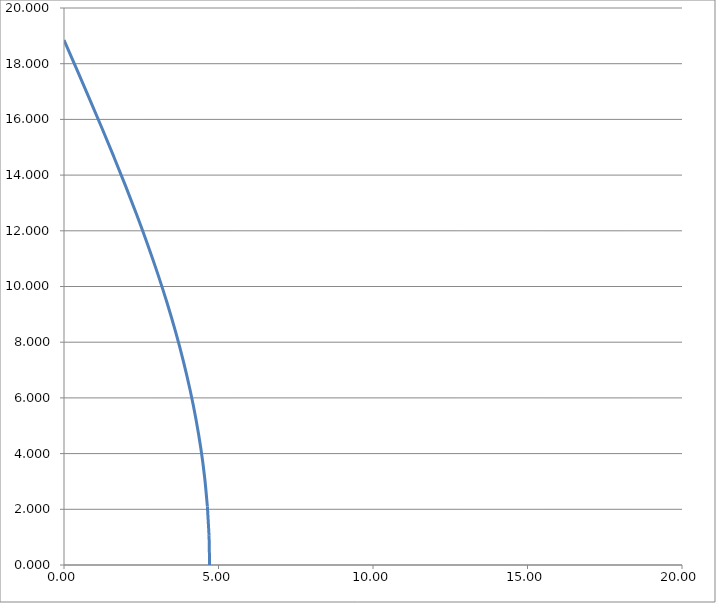
| Category | Series 0 |
|---|---|
| 4.71238898038469 | 0 |
| 4.694456917605194 | 1.047 |
| 4.640797203092136 | 2.094 |
| 4.5518182196735815 | 3.142 |
| 4.428197151140324 | 4.189 |
| 4.270874828468343 | 5.236 |
| 4.08104856952699 | 6.283 |
| 3.8601630667670364 | 7.33 |
| 3.6098993922387983 | 8.378 |
| 3.3321622036187746 | 9.425 |
| 3.029065248614663 | 10.472 |
| 2.7029152780689905 | 11.519 |
| 2.3561944901923453 | 12.566 |
| 1.9915416395362044 | 13.614 |
| 1.611731954477474 | 14.661 |
| 1.2196560160548067 | 15.708 |
| 0.8182977589015257 | 16.755 |
| 0.410711761701307 | 17.802 |
| 2.886688039123355e-16 | 18.85 |